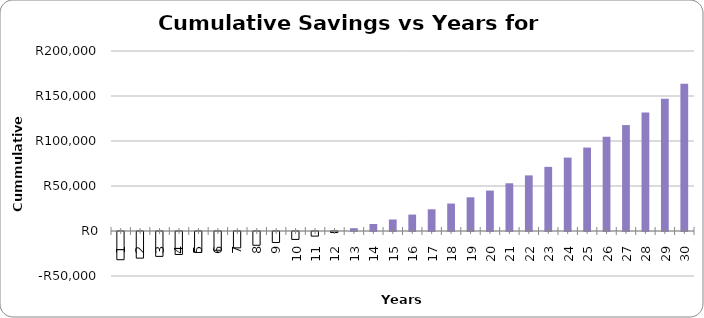
| Category | Cumulative Savings |
|---|---|
| 1.0 | -31356 |
| 2.0 | -29574.48 |
| 3.0 | -27644.078 |
| 4.0 | -25552.503 |
| 5.0 | -23286.456 |
| 6.0 | -20831.55 |
| 7.0 | -18172.222 |
| 8.0 | -15291.636 |
| 9.0 | -12171.582 |
| 10.0 | -8792.361 |
| 11.0 | -5132.665 |
| 12.0 | -1169.449 |
| 13.0 | 3122.215 |
| 14.0 | 7769.285 |
| 15.0 | 12800.919 |
| 16.0 | 18248.648 |
| 17.0 | 24146.575 |
| 18.0 | 30531.578 |
| 19.0 | 37443.538 |
| 20.0 | 44925.581 |
| 21.0 | 53024.341 |
| 22.0 | 61790.245 |
| 23.0 | 71277.818 |
| 24.0 | 81546.019 |
| 25.0 | 92658.594 |
| 26.0 | 104684.468 |
| 27.0 | 117698.164 |
| 28.0 | 131780.252 |
| 29.0 | 147017.841 |
| 30.0 | 163505.107 |